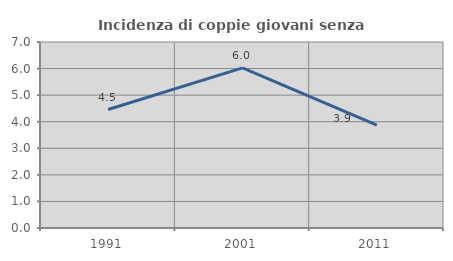
| Category | Incidenza di coppie giovani senza figli |
|---|---|
| 1991.0 | 4.459 |
| 2001.0 | 6.027 |
| 2011.0 | 3.876 |